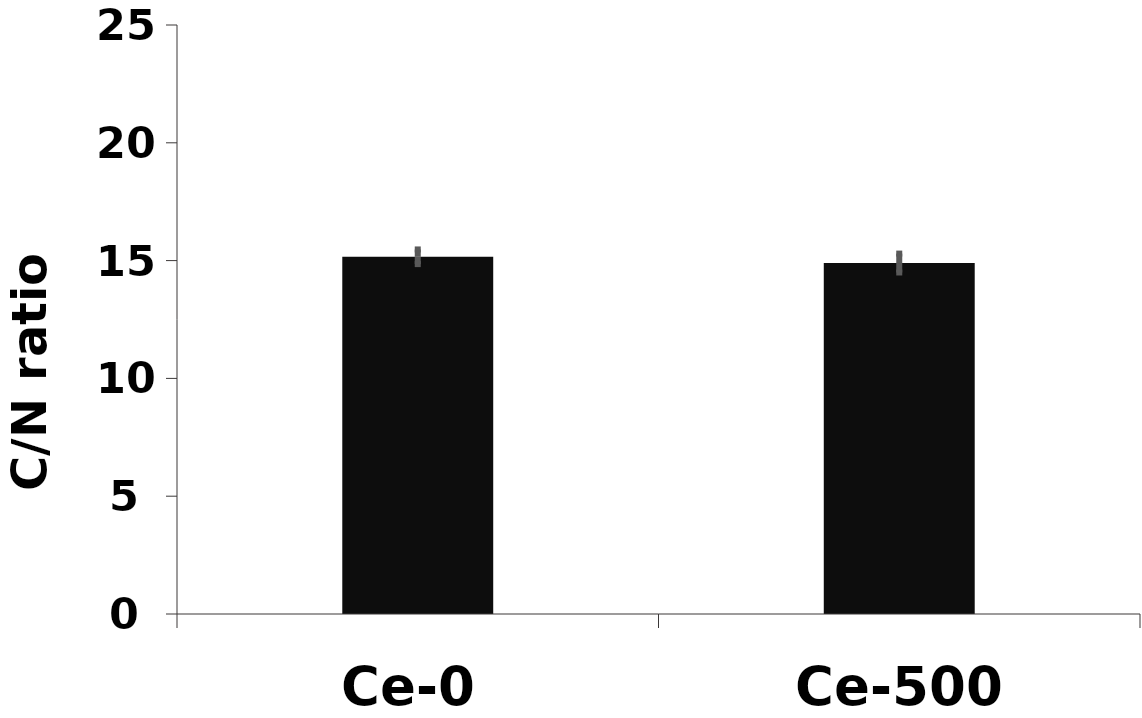
| Category | C/N |
|---|---|
| Ce-0 | 15.162 |
| Ce-500 | 14.896 |